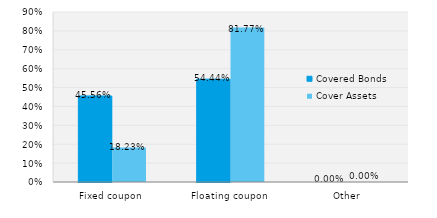
| Category | Covered Bonds | Cover Assets |
|---|---|---|
| Fixed coupon | 0.456 | 0.182 |
| Floating coupon | 0.544 | 0.818 |
| Other | 0 | 0 |